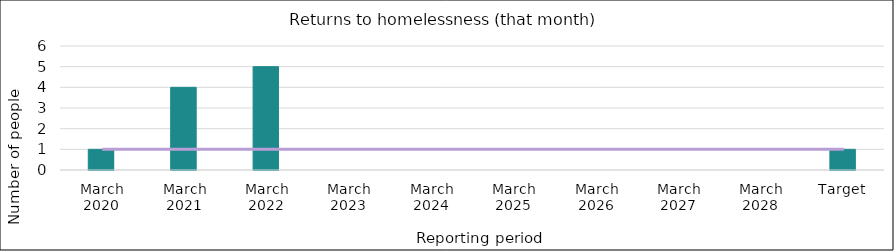
| Category | Series 0 |
|---|---|
| March 2020 | 1 |
| March 2021 | 4 |
| March 2022 | 5 |
| March 2023 | 0 |
| March 2024 | 0 |
| March 2025 | 0 |
| March 2026 | 0 |
| March 2027 | 0 |
| March 2028 | 0 |
| Target | 1 |